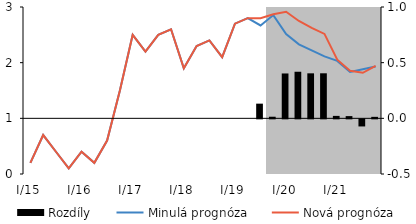
| Category | Rozdíly |
|---|---|
| I/15 | 0 |
| II | 0 |
| III | 0 |
| IV | 0 |
| I/16 | 0 |
| II | 0 |
| III | 0 |
| IV | 0 |
| I/17 | 0 |
| II | 0 |
| III | 0 |
| IV | 0 |
| I/18 | 0 |
| II | 0 |
| III | 0 |
| IV | 0 |
| I/19 | 0 |
| II | 0 |
| III | 0.132 |
| IV | 0.014 |
| I/20 | 0.403 |
| II | 0.418 |
| III | 0.404 |
| IV | 0.405 |
| I/21 | 0.022 |
| II | 0.02 |
| III | -0.064 |
| IV | 0.013 |